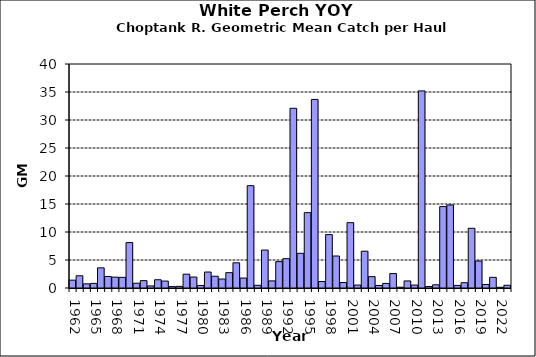
| Category | Series 0 |
|---|---|
| 1962.0 | 1.403 |
| 1963.0 | 2.183 |
| 1964.0 | 0.742 |
| 1965.0 | 0.822 |
| 1966.0 | 3.601 |
| 1967.0 | 2.06 |
| 1968.0 | 1.941 |
| 1969.0 | 1.9 |
| 1970.0 | 8.113 |
| 1971.0 | 0.854 |
| 1972.0 | 1.312 |
| 1973.0 | 0.373 |
| 1974.0 | 1.474 |
| 1975.0 | 1.238 |
| 1976.0 | 0.251 |
| 1977.0 | 0.293 |
| 1978.0 | 2.466 |
| 1979.0 | 1.956 |
| 1980.0 | 0.452 |
| 1981.0 | 2.851 |
| 1982.0 | 2.102 |
| 1983.0 | 1.599 |
| 1984.0 | 2.739 |
| 1985.0 | 4.498 |
| 1986.0 | 1.775 |
| 1987.0 | 18.272 |
| 1988.0 | 0.484 |
| 1989.0 | 6.773 |
| 1990.0 | 1.268 |
| 1991.0 | 4.712 |
| 1992.0 | 5.239 |
| 1993.0 | 32.093 |
| 1994.0 | 6.195 |
| 1995.0 | 13.454 |
| 1996.0 | 33.678 |
| 1997.0 | 1.162 |
| 1998.0 | 9.539 |
| 1999.0 | 5.716 |
| 2000.0 | 0.975 |
| 2001.0 | 11.668 |
| 2002.0 | 0.522 |
| 2003.0 | 6.569 |
| 2004.0 | 2.03 |
| 2005.0 | 0.452 |
| 2006.0 | 0.816 |
| 2007.0 | 2.577 |
| 2008.0 | 0.142 |
| 2009.0 | 1.26 |
| 2010.0 | 0.523 |
| 2011.0 | 35.199 |
| 2012.0 | 0.266 |
| 2013.0 | 0.572 |
| 2014.0 | 14.537 |
| 2015.0 | 14.825 |
| 2016.0 | 0.461 |
| 2017.0 | 0.951 |
| 2018.0 | 10.663 |
| 2019.0 | 4.82 |
| 2020.0 | 0.63 |
| 2021.0 | 1.906 |
| 2022.0 | 0.128 |
| 2023.0 | 0.486 |